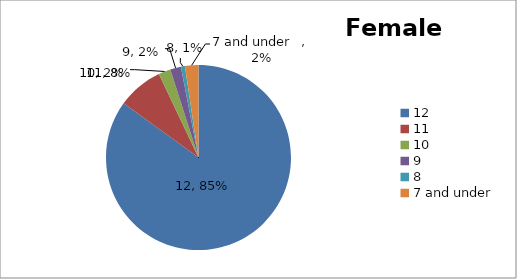
| Category | Series 0 |
|---|---|
| 12 | 362 |
| 11 | 34 |
| 10 | 9 |
| 9 | 8 |
| 8 | 3 |
| 7 and under    | 10 |